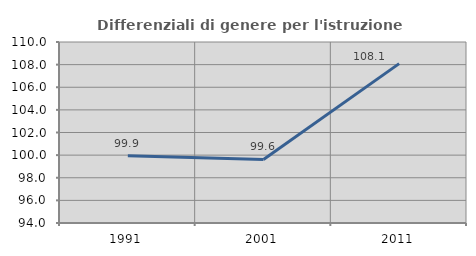
| Category | Differenziali di genere per l'istruzione superiore |
|---|---|
| 1991.0 | 99.934 |
| 2001.0 | 99.619 |
| 2011.0 | 108.089 |